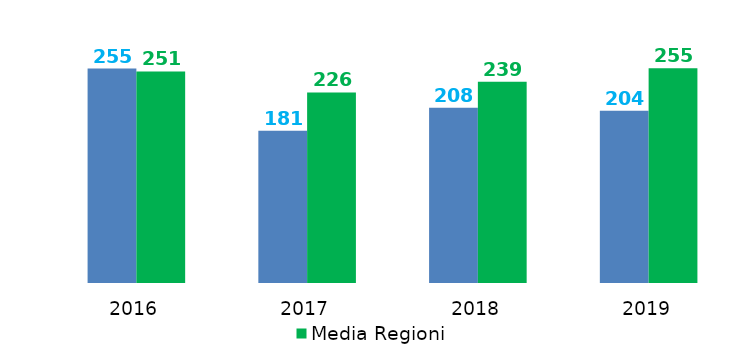
| Category | Investimenti complessivi procapite | Media Regioni |
|---|---|---|
| 2016.0 | 254.506 | 251.098 |
| 2017.0 | 180.823 | 226.204 |
| 2018.0 | 207.91 | 238.984 |
| 2019.0 | 204.45 | 254.877 |